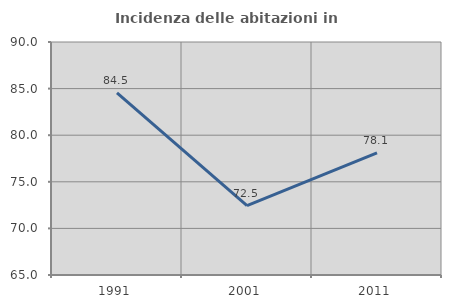
| Category | Incidenza delle abitazioni in proprietà  |
|---|---|
| 1991.0 | 84.53 |
| 2001.0 | 72.455 |
| 2011.0 | 78.102 |